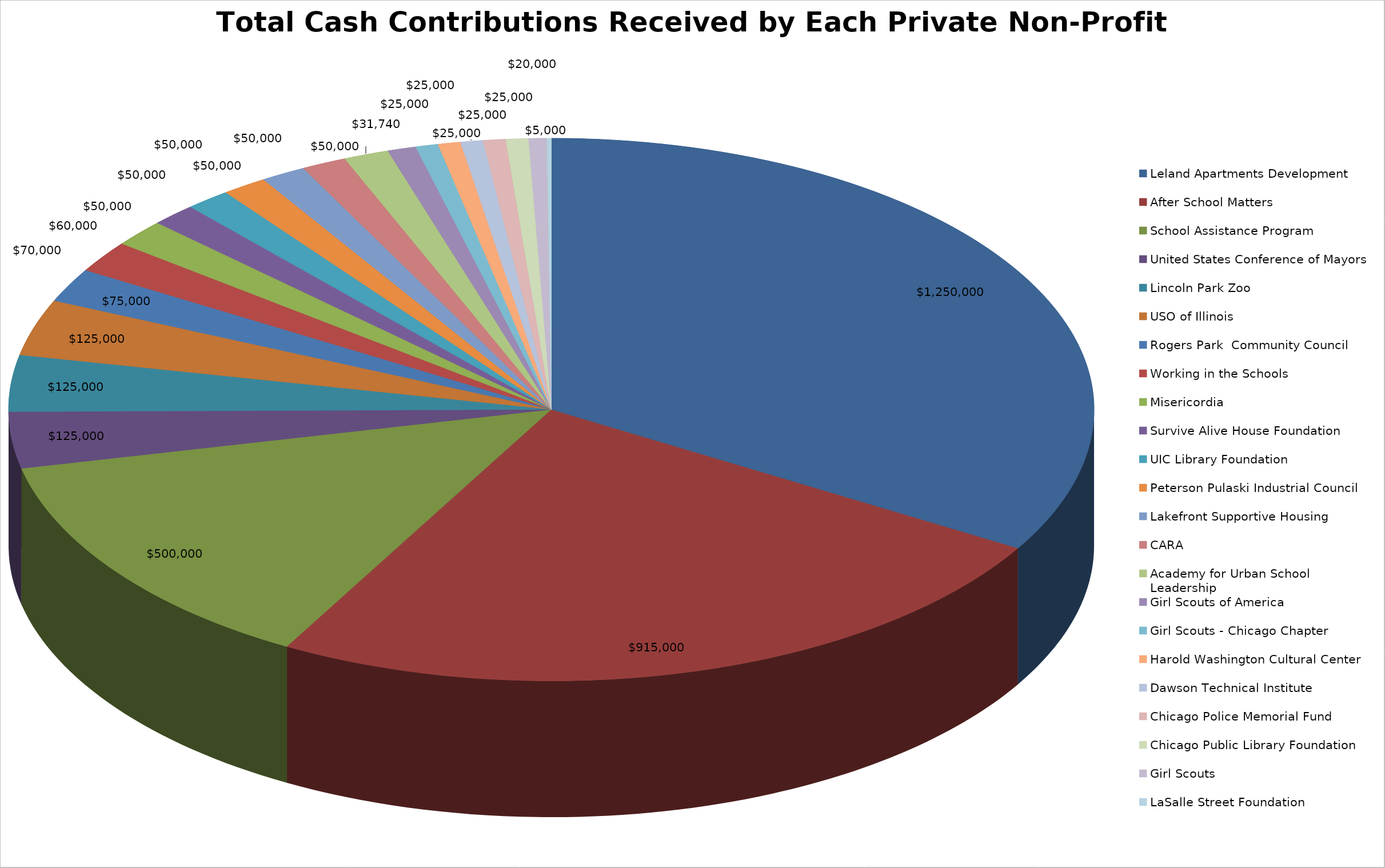
| Category | Total |
|---|---|
| Leland Apartments Development | 1250000 |
| After School Matters | 915000 |
| School Assistance Program | 500000 |
| United States Conference of Mayors | 125000 |
| Lincoln Park Zoo | 125000 |
| USO of Illinois | 125000 |
| Rogers Park  Community Council | 75000 |
| Working in the Schools | 70000 |
| Misericordia | 60000 |
| Survive Alive House Foundation | 50000 |
| UIC Library Foundation | 50000 |
| Peterson Pulaski Industrial Council | 50000 |
| Lakefront Supportive Housing | 50000 |
| CARA | 50000 |
| Academy for Urban School Leadership | 50000 |
| Girl Scouts of America | 31740 |
| Girl Scouts - Chicago Chapter | 25000 |
| Harold Washington Cultural Center | 25000 |
| Dawson Technical Institute | 25000 |
| Chicago Police Memorial Fund | 25000 |
| Chicago Public Library Foundation | 25000 |
| Girl Scouts | 20000 |
| LaSalle Street Foundation | 5000 |